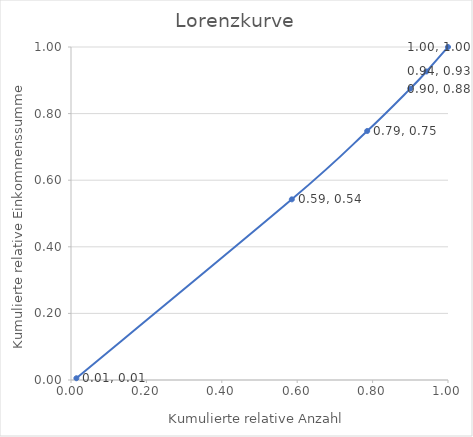
| Category | y |
|---|---|
| 0.014285714285714285 | 0.005 |
| 0.5857142857142857 | 0.542 |
| 0.7857142857142857 | 0.748 |
| 0.9 | 0.875 |
| 0.9428571428571428 | 0.926 |
| 1.0 | 1 |